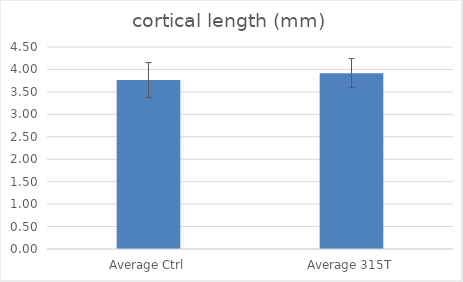
| Category | cortical length (mm) |
|---|---|
| Average Ctrl | 3.766 |
| Average 315T | 3.916 |